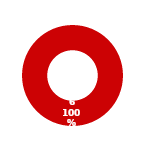
| Category | ARCHITECTURE |
|---|---|
| MIL 1 Complete | 0 |
| MIL 1 Not Complete | 6 |